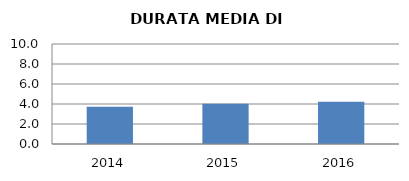
| Category | 2014 2015 2016 |
|---|---|
| 2014.0 | 3.724 |
| 2015.0 | 4.029 |
| 2016.0 | 4.219 |